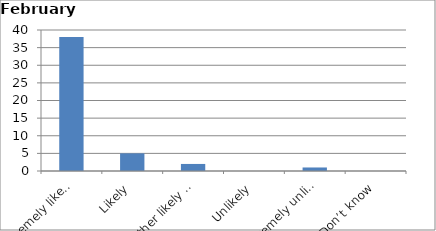
| Category | Series 0 |
|---|---|
| Extremely likely | 38 |
| Likely | 5 |
| Neither likely nor unlikely | 2 |
| Unlikely | 0 |
| Extremely unlikely | 1 |
| Don’t know | 0 |